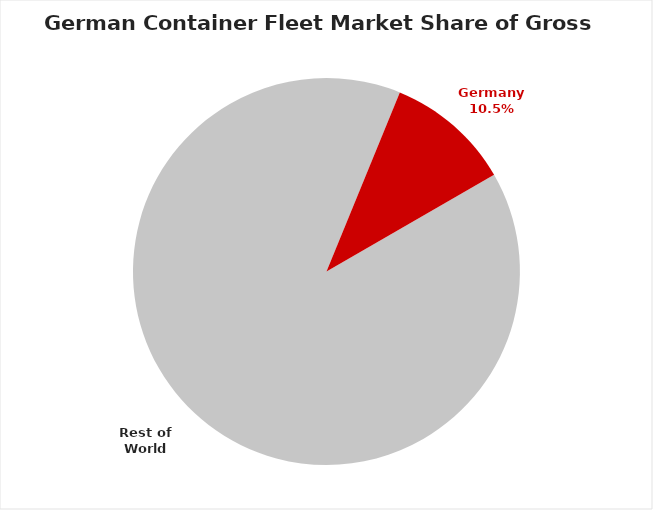
| Category | Container |
|---|---|
| Rest of World | 0.895 |
| Germany | 0.105 |